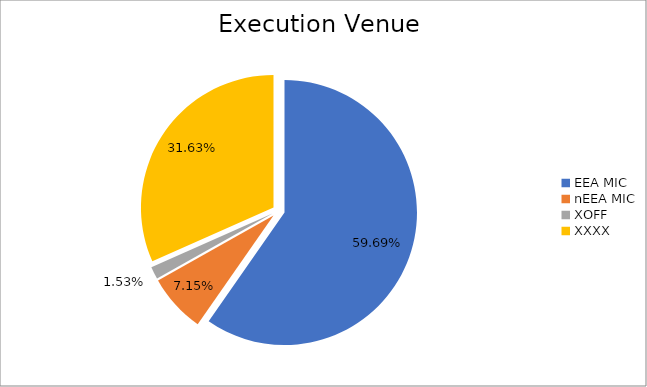
| Category | Series 0 |
|---|---|
| EEA MIC | 8439137.312 |
| nEEA MIC | 1010137.75 |
| XOFF | 215666.067 |
| XXXX | 4472271.789 |